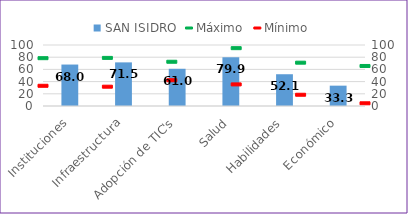
| Category | SAN ISIDRO |
|---|---|
| Instituciones | 67.967 |
| Infraestructura | 71.517 |
| Adopción de TIC's | 60.991 |
| Salud | 79.88 |
| Habilidades | 52.078 |
| Económico | 33.345 |